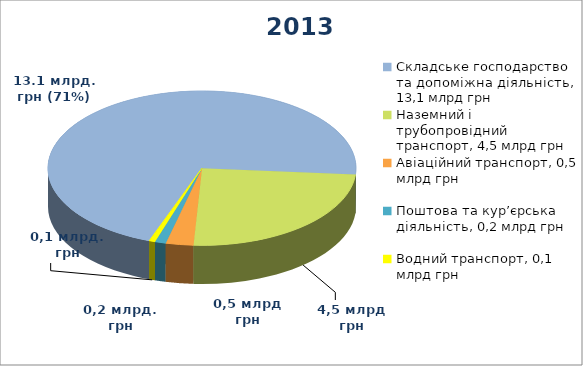
| Category | Series 0 |
|---|---|
| Складське господарство та допоміжна діяльність, 13,1 млрд грн | 13073.7 |
| Наземний і трубопровідний транспорт, 4,5 млрд грн | 4535.1 |
| Авіаційний транспорт, 0,5 млрд грн | 536.1 |
| Поштова та кур’єрська діяльність, 0,2 млрд грн | 211.5 |
| Водний транспорт, 0,1 млрд грн | 116.2 |